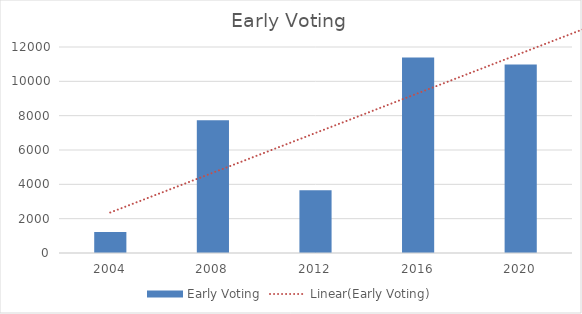
| Category | Early Voting |
|---|---|
| 2004 | 1217 |
| 2008 | 7731 |
| 2012 | 3654 |
| 2016 | 11386 |
| 2020 | 10975 |